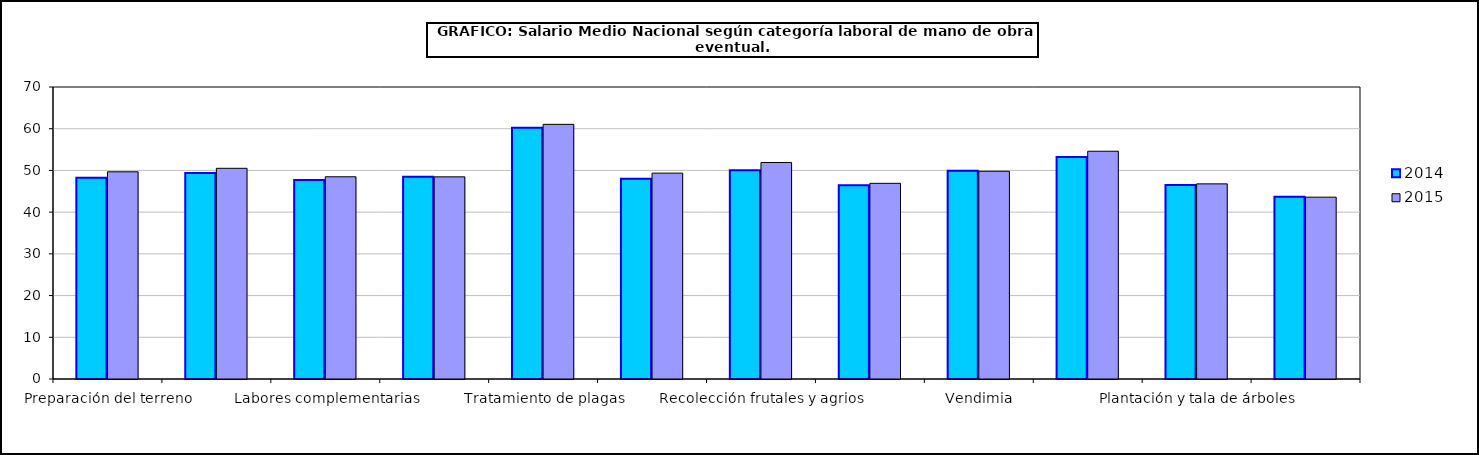
| Category | 2014 | 2015 |
|---|---|---|
|  Preparación del terreno | 48.24 | 49.67 |
|  Siembra y abonado | 49.36 | 50.51 |
|  Labores complementarias | 47.69 | 48.48 |
|  Riegos | 48.51 | 48.46 |
|  Tratamiento de plagas | 60.23 | 61.05 |
|  Recolección productos herbáceos | 48.01 | 49.35 |
|  Recolección frutales y agrios | 50.02 | 51.9 |
|  Recolección de aceituna | 46.47 | 46.91 |
|  Vendimia | 49.9 | 49.8 |
|  Poda | 53.24 | 54.6 |
|  Plantación y tala de árboles | 46.51 | 46.78 |
|  Manejo de ganado | 43.69 | 43.59 |